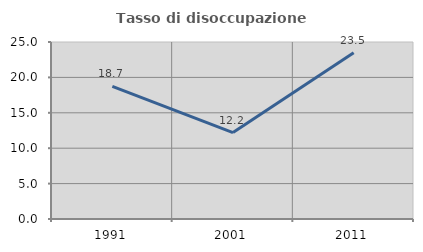
| Category | Tasso di disoccupazione giovanile  |
|---|---|
| 1991.0 | 18.729 |
| 2001.0 | 12.209 |
| 2011.0 | 23.485 |